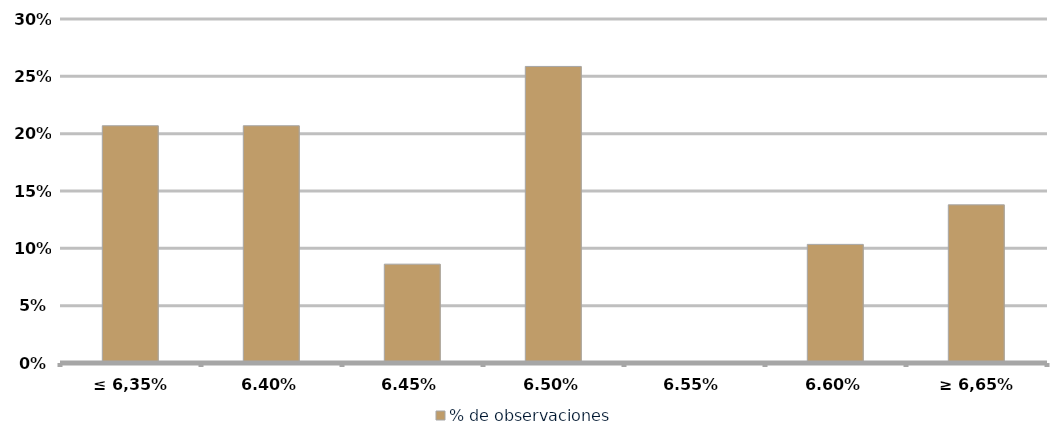
| Category | % de observaciones  |
|---|---|
| ≤ 6,35% | 0.207 |
| 6,40% | 0.207 |
| 6,45% | 0.086 |
| 6,50% | 0.259 |
| 6,55% | 0 |
| 6,60% | 0.103 |
| ≥ 6,65% | 0.138 |